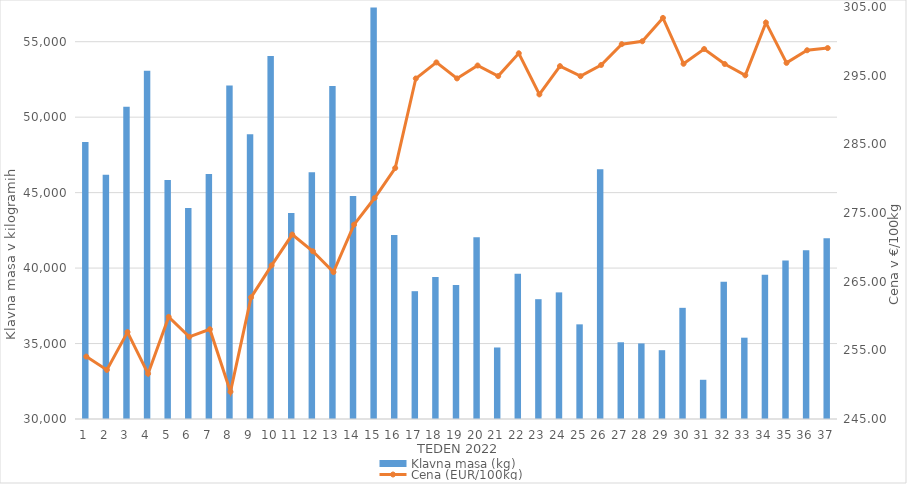
| Category | Klavna masa (kg) |
|---|---|
| 1.0 | 48349 |
| 2.0 | 46187 |
| 3.0 | 50692 |
| 4.0 | 53081 |
| 5.0 | 45844 |
| 6.0 | 43982 |
| 7.0 | 46227 |
| 8.0 | 52099 |
| 9.0 | 48872 |
| 10.0 | 54045 |
| 11.0 | 43645 |
| 12.0 | 46350 |
| 13.0 | 52061 |
| 14.0 | 44774 |
| 15.0 | 57268 |
| 16.0 | 42191 |
| 17.0 | 38469 |
| 18.0 | 39417 |
| 19.0 | 38876 |
| 20.0 | 42047 |
| 21.0 | 34739 |
| 22.0 | 39626 |
| 23.0 | 37939 |
| 24.0 | 38390 |
| 25.0 | 36272 |
| 26.0 | 46553 |
| 27.0 | 35085 |
| 28.0 | 35007 |
| 29.0 | 34559 |
| 30.0 | 37366 |
| 31.0 | 32599 |
| 32.0 | 39100 |
| 33.0 | 35388 |
| 34.0 | 39563 |
| 35.0 | 40507 |
| 36.0 | 41176 |
| 37.0 | 41983 |